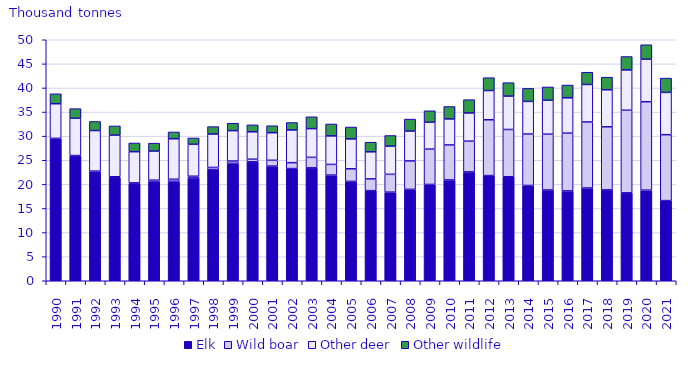
| Category | Elk | Wild boar | Other deer | Other wildlife |
|---|---|---|---|---|
| 1990.0 | 29.516 | 0.038 | 7.172 | 2.058 |
| 1991.0 | 25.913 | 0.066 | 7.734 | 1.995 |
| 1992.0 | 22.67 | 0.073 | 8.416 | 1.885 |
| 1993.0 | 21.398 | 0.178 | 8.637 | 1.903 |
| 1994.0 | 20.117 | 0.187 | 6.471 | 1.808 |
| 1995.0 | 20.688 | 0.173 | 6.051 | 1.637 |
| 1996.0 | 20.644 | 0.419 | 8.402 | 1.405 |
| 1997.0 | 21.34 | 0.347 | 6.62 | 1.314 |
| 1998.0 | 23.061 | 0.451 | 6.923 | 1.547 |
| 1999.0 | 24.364 | 0.477 | 6.306 | 1.536 |
| 2000.0 | 24.676 | 0.539 | 5.693 | 1.438 |
| 2001.0 | 23.79 | 1.198 | 5.726 | 1.445 |
| 2002.0 | 23.278 | 1.222 | 6.787 | 1.542 |
| 2003.0 | 23.423 | 2.179 | 5.962 | 2.453 |
| 2004.0 | 21.92 | 2.218 | 5.919 | 2.465 |
| 2005.0 | 20.615 | 2.614 | 6.205 | 2.465 |
| 2006.0 | 18.698 | 2.428 | 5.626 | 1.999 |
| 2007.0 | 18.381 | 3.698 | 5.85 | 2.204 |
| 2008.0 | 18.967 | 5.9 | 6.192 | 2.482 |
| 2009.0 | 19.979 | 7.326 | 5.59 | 2.37 |
| 2010.0 | 20.914 | 7.262 | 5.399 | 2.577 |
| 2011.0 | 22.585 | 6.376 | 5.856 | 2.758 |
| 2012.0 | 21.822 | 11.579 | 6.066 | 2.663 |
| 2013.0 | 21.582 | 9.798 | 6.925 | 2.79 |
| 2014.0 | 19.77 | 10.662 | 6.773 | 2.712 |
| 2015.0 | 18.84 | 11.568 | 7.04 | 2.755 |
| 2016.0 | 18.641 | 11.983 | 7.332 | 2.647 |
| 2017.0 | 19.242 | 13.706 | 7.777 | 2.539 |
| 2018.0 | 18.854 | 13.08 | 7.693 | 2.612 |
| 2019.0 | 18.24 | 17.135 | 8.365 | 2.778 |
| 2020.0 | 18.802 | 18.342 | 8.824 | 3.001 |
| 2021.0 | 16.624 | 13.677 | 8.776 | 2.965 |